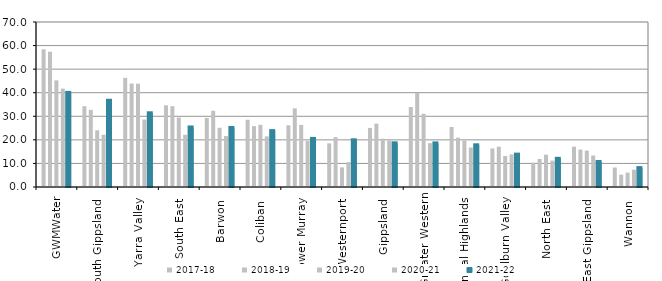
| Category | 2017-18 | 2018-19 | 2019-20 | 2020-21 | 2021-22 |
|---|---|---|---|---|---|
| GWMWater | 58.486 | 57.381 | 45.238 | 41.721 | 39.917 |
| South Gippsland  | 34.27 | 32.705 | 24.059 | 22.173 | 36.575 |
| Yarra Valley  | 46.279 | 43.885 | 43.832 | 28.615 | 31.271 |
| South East  | 34.663 | 34.281 | 29.462 | 22.146 | 25.256 |
| Barwon  | 29.333 | 32.333 | 25.124 | 21.616 | 25.055 |
| Coliban  | 28.514 | 25.813 | 26.375 | 21.477 | 23.706 |
| Lower Murray  | 26.187 | 33.365 | 26.327 | 19.572 | 20.402 |
| Westernport  | 18.522 | 21.154 | 8.316 | 10.52 | 19.808 |
| Gippsland  | 25.057 | 26.866 | 20.489 | 19.708 | 18.523 |
| Greater Western | 33.932 | 39.885 | 31.054 | 18.582 | 18.493 |
| Central Highlands  | 25.444 | 20.918 | 19.723 | 16.762 | 17.691 |
| Goulburn Valley  | 16.378 | 17.094 | 13.159 | 13.864 | 13.734 |
| North East  | 10.321 | 11.898 | 13.695 | 11.168 | 11.958 |
| East Gippsland  | 17.104 | 15.871 | 15.444 | 13.361 | 10.617 |
| Wannon  | 8.262 | 5.211 | 6.111 | 7.345 | 8.022 |